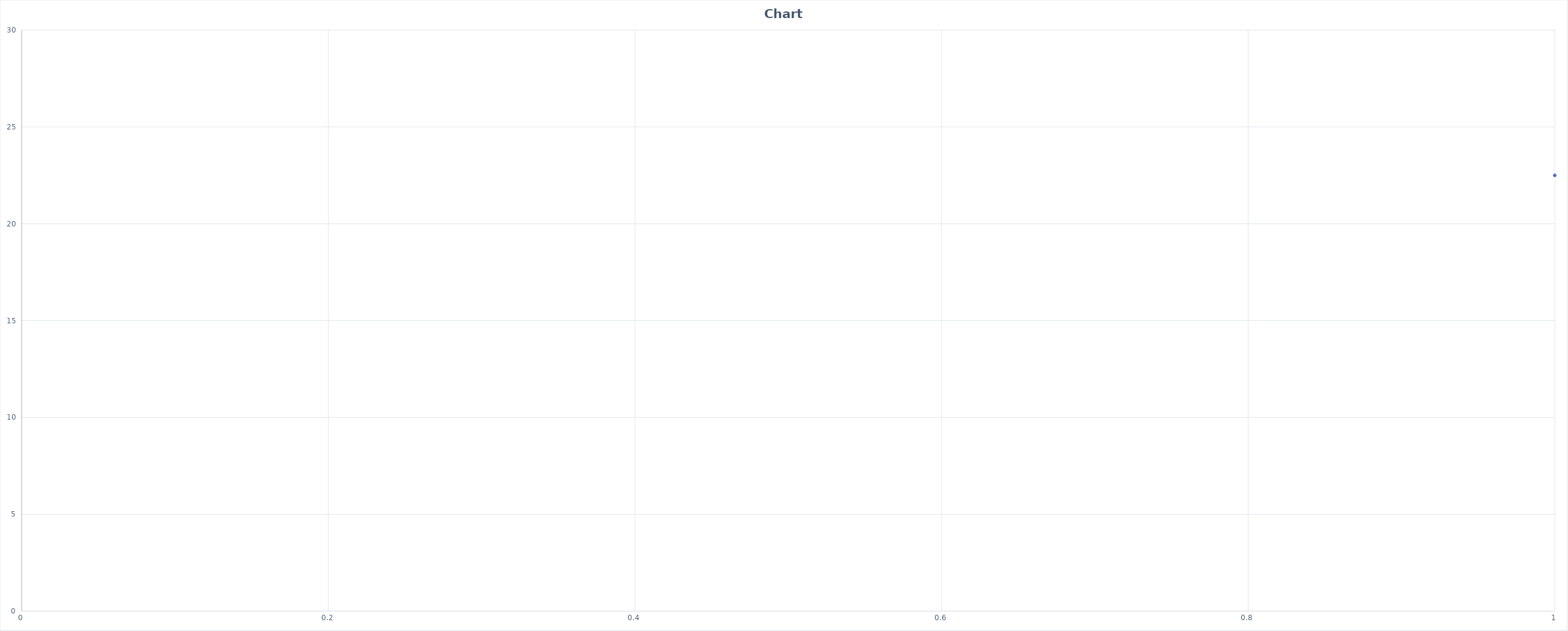
| Category | Series 0 |
|---|---|
| 0 | 22.5 |
| 1 | 22.5 |
| 2 | 22.5 |
| 3 | 22.5 |
| 4 | 22.5 |
| 5 | 22.5 |
| 6 | 22.5 |
| 7 | 22.5 |
| 8 | 22.5 |
| 9 | 22.5 |
| 10 | 22.5 |
| 11 | 22.5 |
| 12 | 22.5 |
| 13 | 22.5 |
| 14 | 22.5 |
| 15 | 22.5 |
| 16 | 22.5 |
| 17 | 22.5 |
| 18 | 22.5 |
| 19 | 22.5 |
| 20 | 22.5 |
| 21 | 22.5 |
| 22 | 22.5 |
| 23 | 22.6 |
| 24 | 22.6 |
| 25 | 22.6 |
| 26 | 22.6 |
| 27 | 22.5 |
| 28 | 22.5 |
| 29 | 22.5 |
| 30 | 22.5 |
| 31 | 22.5 |
| 32 | 22.5 |
| 33 | 22.5 |
| 34 | 22.5 |
| 35 | 22.5 |
| 36 | 22.5 |
| 37 | 22.5 |
| 38 | 22.5 |
| 39 | 22.5 |
| 40 | 22.5 |
| 41 | 22.5 |
| 42 | 22.5 |
| 43 | 22.5 |
| 44 | 22.5 |
| 45 | 22.5 |
| 46 | 22.5 |
| 47 | 22.5 |
| 48 | 22.5 |
| 49 | 22.5 |
| 50 | 22.5 |
| 51 | 23.2 |
| 52 | 23.5 |
| 53 | 23.8 |
| 54 | 23.9 |
| 55 | 24.1 |
| 56 | 24.2 |
| 57 | 24.2 |
| 58 | 24.3 |
| 59 | 24.3 |
| 60 | 24.3 |
| 61 | 24.3 |
| 62 | 24.3 |
| 63 | 24.3 |
| 64 | 24.3 |
| 65 | 24.3 |
| 66 | 24.2 |
| 67 | 24.2 |
| 68 | 24.2 |
| 69 | 24.1 |
| 70 | 24.1 |
| 71 | 24.1 |
| 72 | 24 |
| 73 | 24 |
| 74 | 22.8 |
| 75 | 22.8 |
| 76 | 22.8 |
| 77 | 22.8 |
| 78 | 22.7 |
| 79 | 22.7 |
| 80 | 22.7 |
| 81 | 22.7 |
| 82 | 22.7 |
| 83 | 22.7 |
| 84 | 22.6 |
| 85 | 22.6 |
| 86 | 22.6 |
| 87 | 22.6 |
| 88 | 22.6 |
| 89 | 22.6 |
| 90 | 22.6 |
| 91 | 22.6 |
| 92 | 22.5 |
| 93 | 22.5 |
| 94 | 22.5 |
| 95 | 22.5 |
| 96 | 22.5 |
| 97 | 22.5 |
| 98 | 22.5 |
| 99 | 22.5 |
| 100 | 22.5 |
| 101 | 22.5 |
| 102 | 22.5 |
| 103 | 22.5 |
| 104 | 22.5 |
| 105 | 22.5 |
| 106 | 22.5 |
| 107 | 22.5 |
| 108 | 22.5 |
| 109 | 22.5 |
| 110 | 22.5 |
| 111 | 22.5 |
| 112 | 22.5 |
| 113 | 22.5 |
| 114 | 22.5 |
| 115 | 22.5 |
| 116 | 22.5 |
| 117 | 22.5 |
| 118 | 22.5 |
| 119 | 22.6 |
| 120 | 22.6 |
| 121 | 22.6 |
| 122 | 22.6 |
| 123 | 22.6 |
| 124 | 22.7 |
| 125 | 22.7 |
| 126 | 22.7 |
| 127 | 22.7 |
| 128 | 22.8 |
| 129 | 22.9 |
| 130 | 22.9 |
| 131 | 22.9 |
| 132 | 22.9 |
| 133 | 22.9 |
| 134 | 22.9 |
| 135 | 22.9 |
| 136 | 22.9 |
| 137 | 22.9 |
| 138 | 22.9 |
| 139 | 22.9 |
| 140 | 22.9 |
| 141 | 22.8 |
| 142 | 22.7 |
| 143 | 22.6 |
| 144 | 22.6 |
| 145 | 22.6 |
| 146 | 22.5 |
| 147 | 23.1 |
| 148 | 23.4 |
| 149 | 23.6 |
| 150 | 23.8 |
| 151 | 23.9 |
| 152 | 23.9 |
| 153 | 24 |
| 154 | 24 |
| 155 | 24.1 |
| 156 | 24.1 |
| 157 | 24.1 |
| 158 | 24.1 |
| 159 | 24.1 |
| 160 | 24.1 |
| 161 | 24.1 |
| 162 | 24.1 |
| 163 | 24.1 |
| 164 | 24 |
| 165 | 24 |
| 166 | 24 |
| 167 | 24 |
| 168 | 23.9 |
| 169 | 23.9 |
| 170 | 22.8 |
| 171 | 22.8 |
| 172 | 22.8 |
| 173 | 22.8 |
| 174 | 22.8 |
| 175 | 22.7 |
| 176 | 22.7 |
| 177 | 22.7 |
| 178 | 22.7 |
| 179 | 22.7 |
| 180 | 22.7 |
| 181 | 22.7 |
| 182 | 22.6 |
| 183 | 22.6 |
| 184 | 22.6 |
| 185 | 22.6 |
| 186 | 22.6 |
| 187 | 22.6 |
| 188 | 22.6 |
| 189 | 22.6 |
| 190 | 22.6 |
| 191 | 22.6 |
| 192 | 22.6 |
| 193 | 22.6 |
| 194 | 22.6 |
| 195 | 22.6 |
| 196 | 22.6 |
| 197 | 22.6 |
| 198 | 22.7 |
| 199 | 22.7 |
| 200 | 22.7 |
| 201 | 22.7 |
| 202 | 22.7 |
| 203 | 22.7 |
| 204 | 22.7 |
| 205 | 22.7 |
| 206 | 22.7 |
| 207 | 22.7 |
| 208 | 22.7 |
| 209 | 22.7 |
| 210 | 22.7 |
| 211 | 22.7 |
| 212 | 22.7 |
| 213 | 22.6 |
| 214 | 22.6 |
| 215 | 22.6 |
| 216 | 22.6 |
| 217 | 22.6 |
| 218 | 22.6 |
| 219 | 22.6 |
| 220 | 22.6 |
| 221 | 22.6 |
| 222 | 22.7 |
| 223 | 22.7 |
| 224 | 22.7 |
| 225 | 22.7 |
| 226 | 22.7 |
| 227 | 22.7 |
| 228 | 22.7 |
| 229 | 22.6 |
| 230 | 22.6 |
| 231 | 22.6 |
| 232 | 22.6 |
| 233 | 22.6 |
| 234 | 22.6 |
| 235 | 22.6 |
| 236 | 22.6 |
| 237 | 22.6 |
| 238 | 22.6 |
| 239 | 22.6 |
| 240 | 22.6 |
| 241 | 22.6 |
| 242 | 22.4 |
| 243 | 22.5 |
| 244 | 22.5 |
| 245 | 22.4 |
| 246 | 22.4 |
| 247 | 22.4 |
| 248 | 22.3 |
| 249 | 22.3 |
| 250 | 22.3 |
| 251 | 22.2 |
| 252 | 22.2 |
| 253 | 22.1 |
| 254 | 22.1 |
| 255 | 22.1 |
| 256 | 22 |
| 257 | 22 |
| 258 | 22 |
| 259 | 21.9 |
| 260 | 21.9 |
| 261 | 21.9 |
| 262 | 21.8 |
| 263 | 21.8 |
| 264 | 21.7 |
| 265 | 21.6 |
| 266 | 22.4 |
| 267 | 22.7 |
| 268 | 22.7 |
| 269 | 22.7 |
| 270 | 22.7 |
| 271 | 22.8 |
| 272 | 22.7 |
| 273 | 22.7 |
| 274 | 22.7 |
| 275 | 22.7 |
| 276 | 22.7 |
| 277 | 22.7 |
| 278 | 22.7 |
| 279 | 22.7 |
| 280 | 22.6 |
| 281 | 22.6 |
| 282 | 22.6 |
| 283 | 22.6 |
| 284 | 22.6 |
| 285 | 22.6 |
| 286 | 22.5 |
| 287 | 22.5 |
| 288 | 22.5 |
| 289 | 22.5 |
| 290 | 22.5 |
| 291 | 22.5 |
| 292 | 22.5 |
| 293 | 22.5 |
| 294 | 22.5 |
| 295 | 22.5 |
| 296 | 22.5 |
| 297 | 22.5 |
| 298 | 22.5 |
| 299 | 22.5 |
| 300 | 22.5 |
| 301 | 22.5 |
| 302 | 22.5 |
| 303 | 22.5 |
| 304 | 22.5 |
| 305 | 22.5 |
| 306 | 22.5 |
| 307 | 22.5 |
| 308 | 22.5 |
| 309 | 22.5 |
| 310 | 22.5 |
| 311 | 22.5 |
| 312 | 22.5 |
| 313 | 22.5 |
| 314 | 22.5 |
| 315 | 22.5 |
| 316 | 22.5 |
| 317 | 22.5 |
| 318 | 22.5 |
| 319 | 22.5 |
| 320 | 22.5 |
| 321 | 22.5 |
| 322 | 22.5 |
| 323 | 22.4 |
| 324 | 22.4 |
| 325 | 22.4 |
| 326 | 22.4 |
| 327 | 22.4 |
| 328 | 22.4 |
| 329 | 22.4 |
| 330 | 22.4 |
| 331 | 22.4 |
| 332 | 22.4 |
| 333 | 22.4 |
| 334 | 22.4 |
| 335 | 22.4 |
| 336 | 22.4 |
| 337 | 22.4 |
| 338 | 22.4 |
| 339 | 22.7 |
| 340 | 22.8 |
| 341 | 22.9 |
| 342 | 22.9 |
| 343 | 22.9 |
| 344 | 23 |
| 345 | 23 |
| 346 | 23 |
| 347 | 23 |
| 348 | 23 |
| 349 | 23 |
| 350 | 23 |
| 351 | 23 |
| 352 | 23 |
| 353 | 23 |
| 354 | 23 |
| 355 | 23 |
| 356 | 23 |
| 357 | 23 |
| 358 | 22.9 |
| 359 | 22.9 |
| 360 | 22.9 |
| 361 | 22.9 |
| 362 | 22.6 |
| 363 | 22.7 |
| 364 | 22.7 |
| 365 | 22.7 |
| 366 | 22.7 |
| 367 | 22.7 |
| 368 | 22.6 |
| 369 | 22.6 |
| 370 | 22.6 |
| 371 | 22.6 |
| 372 | 22.5 |
| 373 | 22.5 |
| 374 | 22.5 |
| 375 | 22.5 |
| 376 | 22.5 |
| 377 | 22.5 |
| 378 | 22.5 |
| 379 | 22.5 |
| 380 | 22.5 |
| 381 | 22.5 |
| 382 | 22.5 |
| 383 | 22.5 |
| 384 | 22.5 |
| 385 | 22.5 |
| 386 | 22.5 |
| 387 | 22.5 |
| 388 | 22.5 |
| 389 | 22.5 |
| 390 | 22.5 |
| 391 | 22.5 |
| 392 | 22.4 |
| 393 | 22.4 |
| 394 | 22.4 |
| 395 | 22.4 |
| 396 | 22.4 |
| 397 | 22.4 |
| 398 | 22.4 |
| 399 | 22.4 |
| 400 | 22.4 |
| 401 | 22.4 |
| 402 | 22.4 |
| 403 | 22.4 |
| 404 | 22.4 |
| 405 | 22.4 |
| 406 | 22.4 |
| 407 | 22.4 |
| 408 | 22.4 |
| 409 | 22.4 |
| 410 | 22.4 |
| 411 | 22.4 |
| 412 | 22.4 |
| 413 | 22.4 |
| 414 | 0 |
| 415 | 0 |
| 416 | 0 |
| 417 | 0 |
| 418 | 0 |
| 419 | 0 |
| 420 | 0 |
| 421 | 0 |
| 422 | 0 |
| 423 | 0 |
| 424 | 0 |
| 425 | 0 |
| 426 | 0 |
| 427 | 0 |
| 428 | 0 |
| 429 | 0 |
| 430 | 0 |
| 431 | 0 |
| 432 | 0 |
| 433 | 0 |
| 434 | 0 |
| 435 | 0 |
| 436 | 0 |
| 437 | 0 |
| 438 | 0 |
| 439 | 0 |
| 440 | 0 |
| 441 | 0 |
| 442 | 0 |
| 443 | 0 |
| 444 | 0 |
| 445 | 0 |
| 446 | 0 |
| 447 | 0 |
| 448 | 0 |
| 449 | 0 |
| 450 | 0 |
| 451 | 0 |
| 452 | 0 |
| 453 | 0 |
| 454 | 0 |
| 455 | 0 |
| 456 | 0 |
| 457 | 0 |
| 458 | 0 |
| 459 | 0 |
| 460 | 0 |
| 461 | 0 |
| 462 | 0 |
| 463 | 0 |
| 464 | 0 |
| 465 | 0 |
| 466 | 0 |
| 467 | 0 |
| 468 | 0 |
| 469 | 0 |
| 470 | 0 |
| 471 | 0 |
| 472 | 0 |
| 473 | 0 |
| 474 | 0 |
| 475 | 0 |
| 476 | 0 |
| 477 | 0 |
| 478 | 0 |
| 479 | 0 |
| 480 | 0 |
| 481 | 0 |
| 482 | 0 |
| 483 | 0 |
| 484 | 0 |
| 485 | 0 |
| 486 | 0 |
| 487 | 0 |
| 488 | 0 |
| 489 | 0 |
| 490 | 0 |
| 491 | 0 |
| 492 | 0 |
| 493 | 0 |
| 494 | 0 |
| 495 | 0 |
| 496 | 0 |
| 497 | 0 |
| 498 | 0 |
| 499 | 0 |
| 500 | 0 |
| 501 | 0 |
| 502 | 0 |
| 503 | 0 |
| 504 | 0 |
| 505 | 0 |
| 506 | 0 |
| 507 | 0 |
| 508 | 0 |
| 509 | 0 |
| 510 | 0 |
| 511 | 0 |
| 512 | 0 |
| 513 | 0 |
| 514 | 0 |
| 515 | 0 |
| 516 | 0 |
| 517 | 0 |
| 518 | 0 |
| 519 | 0 |
| 520 | 0 |
| 521 | 0 |
| 522 | 0 |
| 523 | 0 |
| 524 | 0 |
| 525 | 0 |
| 526 | 0 |
| 527 | 0 |
| 528 | 0 |
| 529 | 0 |
| 530 | 0 |
| 531 | 0 |
| 532 | 0 |
| 533 | 0 |
| 534 | 0 |
| 535 | 0 |
| 536 | 0 |
| 537 | 0 |
| 538 | 0 |
| 539 | 0 |
| 540 | 0 |
| 541 | 0 |
| 542 | 0 |
| 543 | 0 |
| 544 | 0 |
| 545 | 0 |
| 546 | 0 |
| 547 | 0 |
| 548 | 0 |
| 549 | 0 |
| 550 | 0 |
| 551 | 0 |
| 552 | 0 |
| 553 | 0 |
| 554 | 0 |
| 555 | 0 |
| 556 | 0 |
| 557 | 0 |
| 558 | 0 |
| 559 | 0 |
| 560 | 0 |
| 561 | 0 |
| 562 | 0 |
| 563 | 0 |
| 564 | 0 |
| 565 | 0 |
| 566 | 0 |
| 567 | 0 |
| 568 | 0 |
| 569 | 0 |
| 570 | 0 |
| 571 | 0 |
| 572 | 0 |
| 573 | 0 |
| 574 | 0 |
| 575 | 0 |
| 576 | 0 |
| 577 | 0 |
| 578 | 0 |
| 579 | 0 |
| 580 | 0 |
| 581 | 0 |
| 582 | 0 |
| 583 | 0 |
| 584 | 0 |
| 585 | 0 |
| 586 | 0 |
| 587 | 0 |
| 588 | 0 |
| 589 | 0 |
| 590 | 0 |
| 591 | 0 |
| 592 | 0 |
| 593 | 0 |
| 594 | 0 |
| 595 | 0 |
| 596 | 0 |
| 597 | 0 |
| 598 | 0 |
| 599 | 0 |
| 600 | 0 |
| 601 | 0 |
| 602 | 0 |
| 603 | 0 |
| 604 | 0 |
| 605 | 0 |
| 606 | 0 |
| 607 | 0 |
| 608 | 0 |
| 609 | 0 |
| 610 | 0 |
| 611 | 0 |
| 612 | 0 |
| 613 | 0 |
| 614 | 0 |
| 615 | 0 |
| 616 | 0 |
| 617 | 0 |
| 618 | 0 |
| 619 | 0 |
| 620 | 0 |
| 621 | 0 |
| 622 | 0 |
| 623 | 0 |
| 624 | 0 |
| 625 | 0 |
| 626 | 0 |
| 627 | 0 |
| 628 | 0 |
| 629 | 0 |
| 630 | 0 |
| 631 | 0 |
| 632 | 0 |
| 633 | 0 |
| 634 | 0 |
| 635 | 0 |
| 636 | 0 |
| 637 | 0 |
| 638 | 0 |
| 639 | 0 |
| 640 | 0 |
| 641 | 0 |
| 642 | 0 |
| 643 | 0 |
| 644 | 0 |
| 645 | 0 |
| 646 | 0 |
| 647 | 0 |
| 648 | 0 |
| 649 | 0 |
| 650 | 0 |
| 651 | 0 |
| 652 | 0 |
| 653 | 0 |
| 654 | 0 |
| 655 | 0 |
| 656 | 0 |
| 657 | 0 |
| 658 | 0 |
| 659 | 0 |
| 660 | 0 |
| 661 | 0 |
| 662 | 0 |
| 663 | 0 |
| 664 | 0 |
| 665 | 0 |
| 666 | 0 |
| 667 | 0 |
| 668 | 0 |
| 669 | 0 |
| 670 | 0 |
| 671 | 0 |
| 672 | 0 |
| 673 | 0 |
| 674 | 0 |
| 675 | 0 |
| 676 | 0 |
| 677 | 0 |
| 678 | 0 |
| 679 | 0 |
| 680 | 0 |
| 681 | 0 |
| 682 | 0 |
| 683 | 0 |
| 684 | 0 |
| 685 | 0 |
| 686 | 0 |
| 687 | 0 |
| 688 | 0 |
| 689 | 0 |
| 690 | 0 |
| 691 | 0 |
| 692 | 0 |
| 693 | 0 |
| 694 | 0 |
| 695 | 0 |
| 696 | 0 |
| 697 | 0 |
| 698 | 0 |
| 699 | 0 |
| 700 | 0 |
| 701 | 0 |
| 702 | 0 |
| 703 | 0 |
| 704 | 0 |
| 705 | 0 |
| 706 | 0 |
| 707 | 0 |
| 708 | 0 |
| 709 | 0 |
| 710 | 0 |
| 711 | 0 |
| 712 | 0 |
| 713 | 0 |
| 714 | 0 |
| 715 | 0 |
| 716 | 0 |
| 717 | 0 |
| 718 | 0 |
| 719 | 0 |
| 720 | 0 |
| 721 | 0 |
| 722 | 0 |
| 723 | 0 |
| 724 | 0 |
| 725 | 0 |
| 726 | 0 |
| 727 | 0 |
| 728 | 0 |
| 729 | 0 |
| 730 | 0 |
| 731 | 0 |
| 732 | 0 |
| 733 | 0 |
| 734 | 0 |
| 735 | 0 |
| 736 | 0 |
| 737 | 0 |
| 738 | 0 |
| 739 | 0 |
| 740 | 0 |
| 741 | 0 |
| 742 | 0 |
| 743 | 0 |
| 744 | 0 |
| 745 | 0 |
| 746 | 0 |
| 747 | 0 |
| 748 | 0 |
| 749 | 0 |
| 750 | 0 |
| 751 | 0 |
| 752 | 0 |
| 753 | 0 |
| 754 | 0 |
| 755 | 0 |
| 756 | 0 |
| 757 | 0 |
| 758 | 0 |
| 759 | 0 |
| 760 | 0 |
| 761 | 0 |
| 762 | 0 |
| 763 | 0 |
| 764 | 0 |
| 765 | 0 |
| 766 | 0 |
| 767 | 0 |
| 768 | 0 |
| 769 | 0 |
| 770 | 0 |
| 771 | 0 |
| 772 | 0 |
| 773 | 0 |
| 774 | 0 |
| 775 | 0 |
| 776 | 0 |
| 777 | 0 |
| 778 | 0 |
| 779 | 0 |
| 780 | 0 |
| 781 | 0 |
| 782 | 0 |
| 783 | 0 |
| 784 | 0 |
| 785 | 0 |
| 786 | 0 |
| 787 | 0 |
| 788 | 0 |
| 789 | 0 |
| 790 | 0 |
| 791 | 0 |
| 792 | 0 |
| 793 | 0 |
| 794 | 0 |
| 795 | 0 |
| 796 | 0 |
| 797 | 0 |
| 798 | 0 |
| 799 | 0 |
| 800 | 0 |
| 801 | 0 |
| 802 | 0 |
| 803 | 0 |
| 804 | 0 |
| 805 | 0 |
| 806 | 0 |
| 807 | 0 |
| 808 | 0 |
| 809 | 0 |
| 810 | 0 |
| 811 | 0 |
| 812 | 0 |
| 813 | 0 |
| 814 | 0 |
| 815 | 0 |
| 816 | 0 |
| 817 | 0 |
| 818 | 0 |
| 819 | 0 |
| 820 | 0 |
| 821 | 0 |
| 822 | 0 |
| 823 | 0 |
| 824 | 0 |
| 825 | 0 |
| 826 | 0 |
| 827 | 0 |
| 828 | 0 |
| 829 | 0 |
| 830 | 0 |
| 831 | 0 |
| 832 | 0 |
| 833 | 0 |
| 834 | 0 |
| 835 | 0 |
| 836 | 0 |
| 837 | 0 |
| 838 | 0 |
| 839 | 0 |
| 840 | 0 |
| 841 | 0 |
| 842 | 0 |
| 843 | 0 |
| 844 | 0 |
| 845 | 0 |
| 846 | 0 |
| 847 | 0 |
| 848 | 0 |
| 849 | 0 |
| 850 | 0 |
| 851 | 0 |
| 852 | 0 |
| 853 | 0 |
| 854 | 0 |
| 855 | 0 |
| 856 | 0 |
| 857 | 0 |
| 858 | 0 |
| 859 | 0 |
| 860 | 0 |
| 861 | 0 |
| 862 | 0 |
| 863 | 0 |
| 864 | 0 |
| 865 | 0 |
| 866 | 0 |
| 867 | 0 |
| 868 | 0 |
| 869 | 0 |
| 870 | 0 |
| 871 | 0 |
| 872 | 0 |
| 873 | 0 |
| 874 | 0 |
| 875 | 0 |
| 876 | 0 |
| 877 | 0 |
| 878 | 0 |
| 879 | 0 |
| 880 | 0 |
| 881 | 0 |
| 882 | 0 |
| 883 | 0 |
| 884 | 0 |
| 885 | 0 |
| 886 | 0 |
| 887 | 0 |
| 888 | 0 |
| 889 | 0 |
| 890 | 0 |
| 891 | 0 |
| 892 | 0 |
| 893 | 0 |
| 894 | 0 |
| 895 | 0 |
| 896 | 0 |
| 897 | 0 |
| 898 | 0 |
| 899 | 0 |
| 900 | 0 |
| 901 | 0 |
| 902 | 0 |
| 903 | 0 |
| 904 | 0 |
| 905 | 0 |
| 906 | 0 |
| 907 | 0 |
| 908 | 0 |
| 909 | 0 |
| 910 | 0 |
| 911 | 0 |
| 912 | 0 |
| 913 | 0 |
| 914 | 0 |
| 915 | 0 |
| 916 | 0 |
| 917 | 0 |
| 918 | 0 |
| 919 | 0 |
| 920 | 0 |
| 921 | 0 |
| 922 | 0 |
| 923 | 0 |
| 924 | 0 |
| 925 | 0 |
| 926 | 0 |
| 927 | 0 |
| 928 | 0 |
| 929 | 0 |
| 930 | 0 |
| 931 | 0 |
| 932 | 0 |
| 933 | 0 |
| 934 | 0 |
| 935 | 0 |
| 936 | 0 |
| 937 | 0 |
| 938 | 0 |
| 939 | 0 |
| 940 | 0 |
| 941 | 0 |
| 942 | 0 |
| 943 | 0 |
| 944 | 0 |
| 945 | 0 |
| 946 | 0 |
| 947 | 0 |
| 948 | 0 |
| 949 | 0 |
| 950 | 0 |
| 951 | 0 |
| 952 | 0 |
| 953 | 0 |
| 954 | 0 |
| 955 | 0 |
| 956 | 0 |
| 957 | 0 |
| 958 | 0 |
| 959 | 0 |
| 960 | 0 |
| 961 | 0 |
| 962 | 0 |
| 963 | 0 |
| 964 | 0 |
| 965 | 0 |
| 966 | 0 |
| 967 | 0 |
| 968 | 0 |
| 969 | 0 |
| 970 | 0 |
| 971 | 0 |
| 972 | 0 |
| 973 | 0 |
| 974 | 0 |
| 975 | 0 |
| 976 | 0 |
| 977 | 0 |
| 978 | 0 |
| 979 | 0 |
| 980 | 0 |
| 981 | 0 |
| 982 | 0 |
| 983 | 0 |
| 984 | 0 |
| 985 | 0 |
| 986 | 0 |
| 987 | 0 |
| 988 | 0 |
| 989 | 0 |
| 990 | 0 |
| 991 | 0 |
| 992 | 0 |
| 993 | 0 |
| 994 | 0 |
| 995 | 0 |
| 996 | 0 |
| 997 | 0 |
| 998 | 0 |
| 999 | 0 |
| 1000 | 0 |
| 1001 | 0 |
| 1002 | 0 |
| 1003 | 0 |
| 1004 | 0 |
| 1005 | 0 |
| 1006 | 0 |
| 1007 | 0 |
| 1008 | 0 |
| 1009 | 0 |
| 1010 | 0 |
| 1011 | 0 |
| 1012 | 0 |
| 1013 | 0 |
| 1014 | 0 |
| 1015 | 0 |
| 1016 | 0 |
| 1017 | 0 |
| 1018 | 0 |
| 1019 | 0 |
| 1020 | 0 |
| 1021 | 0 |
| 1022 | 0 |
| 1023 | 0 |
| 1024 | 0 |
| 1025 | 0 |
| 1026 | 0 |
| 1027 | 0 |
| 1028 | 0 |
| 1029 | 0 |
| 1030 | 0 |
| 1031 | 0 |
| 1032 | 0 |
| 1033 | 0 |
| 1034 | 0 |
| 1035 | 0 |
| 1036 | 0 |
| 1037 | 0 |
| 1038 | 0 |
| 1039 | 0 |
| 1040 | 0 |
| 1041 | 0 |
| 1042 | 0 |
| 1043 | 0 |
| 1044 | 0 |
| 1045 | 0 |
| 1046 | 0 |
| 1047 | 0 |
| 1048 | 0 |
| 1049 | 0 |
| 1050 | 0 |
| 1051 | 0 |
| 1052 | 0 |
| 1053 | 0 |
| 1054 | 0 |
| 1055 | 0 |
| 1056 | 0 |
| 1057 | 0 |
| 1058 | 0 |
| 1059 | 0 |
| 1060 | 0 |
| 1061 | 0 |
| 1062 | 0 |
| 1063 | 0 |
| 1064 | 0 |
| 1065 | 0 |
| 1066 | 0 |
| 1067 | 0 |
| 1068 | 0 |
| 1069 | 0 |
| 1070 | 0 |
| 1071 | 0 |
| 1072 | 0 |
| 1073 | 0 |
| 1074 | 0 |
| 1075 | 0 |
| 1076 | 0 |
| 1077 | 0 |
| 1078 | 0 |
| 1079 | 0 |
| 1080 | 0 |
| 1081 | 0 |
| 1082 | 0 |
| 1083 | 0 |
| 1084 | 0 |
| 1085 | 0 |
| 1086 | 0 |
| 1087 | 0 |
| 1088 | 0 |
| 1089 | 0 |
| 1090 | 0 |
| 1091 | 0 |
| 1092 | 0 |
| 1093 | 0 |
| 1094 | 0 |
| 1095 | 0 |
| 1096 | 0 |
| 1097 | 0 |
| 1098 | 0 |
| 1099 | 0 |
| 1100 | 0 |
| 1101 | 0 |
| 1102 | 0 |
| 1103 | 0 |
| 1104 | 0 |
| 1105 | 0 |
| 1106 | 0 |
| 1107 | 0 |
| 1108 | 0 |
| 1109 | 0 |
| 1110 | 0 |
| 1111 | 0 |
| 1112 | 0 |
| 1113 | 0 |
| 1114 | 0 |
| 1115 | 0 |
| 1116 | 0 |
| 1117 | 0 |
| 1118 | 0 |
| 1119 | 0 |
| 1120 | 0 |
| 1121 | 0 |
| 1122 | 0 |
| 1123 | 0 |
| 1124 | 0 |
| 1125 | 0 |
| 1126 | 0 |
| 1127 | 0 |
| 1128 | 0 |
| 1129 | 0 |
| 1130 | 0 |
| 1131 | 0 |
| 1132 | 0 |
| 1133 | 0 |
| 1134 | 0 |
| 1135 | 0 |
| 1136 | 0 |
| 1137 | 0 |
| 1138 | 0 |
| 1139 | 0 |
| 1140 | 0 |
| 1141 | 0 |
| 1142 | 0 |
| 1143 | 0 |
| 1144 | 0 |
| 1145 | 0 |
| 1146 | 0 |
| 1147 | 0 |
| 1148 | 0 |
| 1149 | 0 |
| 1150 | 0 |
| 1151 | 0 |
| 1152 | 0 |
| 1153 | 0 |
| 1154 | 0 |
| 1155 | 0 |
| 1156 | 0 |
| 1157 | 0 |
| 1158 | 0 |
| 1159 | 0 |
| 1160 | 0 |
| 1161 | 0 |
| 1162 | 0 |
| 1163 | 0 |
| 1164 | 0 |
| 1165 | 0 |
| 1166 | 0 |
| 1167 | 0 |
| 1168 | 0 |
| 1169 | 0 |
| 1170 | 0 |
| 1171 | 0 |
| 1172 | 0 |
| 1173 | 0 |
| 1174 | 0 |
| 1175 | 0 |
| 1176 | 0 |
| 1177 | 0 |
| 1178 | 0 |
| 1179 | 0 |
| 1180 | 0 |
| 1181 | 0 |
| 1182 | 0 |
| 1183 | 0 |
| 1184 | 0 |
| 1185 | 0 |
| 1186 | 0 |
| 1187 | 0 |
| 1188 | 0 |
| 1189 | 0 |
| 1190 | 0 |
| 1191 | 0 |
| 1192 | 0 |
| 1193 | 0 |
| 1194 | 0 |
| 1195 | 0 |
| 1196 | 0 |
| 1197 | 0 |
| 1198 | 0 |
| 1199 | 0 |
| 1200 | 0 |
| 1201 | 0 |
| 1202 | 0 |
| 1203 | 0 |
| 1204 | 0 |
| 1205 | 0 |
| 1206 | 0 |
| 1207 | 0 |
| 1208 | 0 |
| 1209 | 0 |
| 1210 | 0 |
| 1211 | 0 |
| 1212 | 0 |
| 1213 | 0 |
| 1214 | 0 |
| 1215 | 0 |
| 1216 | 0 |
| 1217 | 0 |
| 1218 | 0 |
| 1219 | 0 |
| 1220 | 0 |
| 1221 | 0 |
| 1222 | 0 |
| 1223 | 0 |
| 1224 | 0 |
| 1225 | 0 |
| 1226 | 0 |
| 1227 | 0 |
| 1228 | 0 |
| 1229 | 0 |
| 1230 | 0 |
| 1231 | 0 |
| 1232 | 0 |
| 1233 | 0 |
| 1234 | 0 |
| 1235 | 0 |
| 1236 | 0 |
| 1237 | 0 |
| 1238 | 0 |
| 1239 | 0 |
| 1240 | 0 |
| 1241 | 0 |
| 1242 | 0 |
| 1243 | 0 |
| 1244 | 0 |
| 1245 | 0 |
| 1246 | 0 |
| 1247 | 0 |
| 1248 | 0 |
| 1249 | 0 |
| 1250 | 0 |
| 1251 | 0 |
| 1252 | 0 |
| 1253 | 0 |
| 1254 | 0 |
| 1255 | 0 |
| 1256 | 0 |
| 1257 | 0 |
| 1258 | 0 |
| 1259 | 0 |
| 1260 | 0 |
| 1261 | 0 |
| 1262 | 0 |
| 1263 | 0 |
| 1264 | 0 |
| 1265 | 0 |
| 1266 | 0 |
| 1267 | 0 |
| 1268 | 0 |
| 1269 | 0 |
| 1270 | 0 |
| 1271 | 0 |
| 1272 | 0 |
| 1273 | 0 |
| 1274 | 0 |
| 1275 | 0 |
| 1276 | 0 |
| 1277 | 0 |
| 1278 | 0 |
| 1279 | 0 |
| 1280 | 0 |
| 1281 | 0 |
| 1282 | 0 |
| 1283 | 0 |
| 1284 | 0 |
| 1285 | 0 |
| 1286 | 0 |
| 1287 | 0 |
| 1288 | 0 |
| 1289 | 0 |
| 1290 | 0 |
| 1291 | 0 |
| 1292 | 0 |
| 1293 | 0 |
| 1294 | 0 |
| 1295 | 0 |
| 1296 | 0 |
| 1297 | 0 |
| 1298 | 0 |
| 1299 | 0 |
| 1300 | 0 |
| 1301 | 0 |
| 1302 | 0 |
| 1303 | 0 |
| 1304 | 0 |
| 1305 | 0 |
| 1306 | 0 |
| 1307 | 0 |
| 1308 | 0 |
| 1309 | 0 |
| 1310 | 0 |
| 1311 | 0 |
| 1312 | 0 |
| 1313 | 0 |
| 1314 | 0 |
| 1315 | 0 |
| 1316 | 0 |
| 1317 | 0 |
| 1318 | 0 |
| 1319 | 0 |
| 1320 | 0 |
| 1321 | 0 |
| 1322 | 0 |
| 1323 | 0 |
| 1324 | 0 |
| 1325 | 0 |
| 1326 | 0 |
| 1327 | 0 |
| 1328 | 0 |
| 1329 | 0 |
| 1330 | 0 |
| 1331 | 0 |
| 1332 | 0 |
| 1333 | 0 |
| 1334 | 0 |
| 1335 | 0 |
| 1336 | 0 |
| 1337 | 0 |
| 1338 | 0 |
| 1339 | 0 |
| 1340 | 0 |
| 1341 | 0 |
| 1342 | 0 |
| 1343 | 0 |
| 1344 | 0 |
| 1345 | 0 |
| 1346 | 0 |
| 1347 | 0 |
| 1348 | 0 |
| 1349 | 0 |
| 1350 | 0 |
| 1351 | 0 |
| 1352 | 0 |
| 1353 | 0 |
| 1354 | 0 |
| 1355 | 0 |
| 1356 | 0 |
| 1357 | 0 |
| 1358 | 0 |
| 1359 | 0 |
| 1360 | 0 |
| 1361 | 0 |
| 1362 | 0 |
| 1363 | 0 |
| 1364 | 0 |
| 1365 | 0 |
| 1366 | 0 |
| 1367 | 0 |
| 1368 | 0 |
| 1369 | 0 |
| 1370 | 0 |
| 1371 | 0 |
| 1372 | 0 |
| 1373 | 0 |
| 1374 | 0 |
| 1375 | 0 |
| 1376 | 0 |
| 1377 | 0 |
| 1378 | 0 |
| 1379 | 0 |
| 1380 | 0 |
| 1381 | 0 |
| 1382 | 0 |
| 1383 | 0 |
| 1384 | 0 |
| 1385 | 0 |
| 1386 | 0 |
| 1387 | 0 |
| 1388 | 0 |
| 1389 | 0 |
| 1390 | 0 |
| 1391 | 0 |
| 1392 | 0 |
| 1393 | 0 |
| 1394 | 0 |
| 1395 | 0 |
| 1396 | 0 |
| 1397 | 0 |
| 1398 | 0 |
| 1399 | 0 |
| 1400 | 0 |
| 1401 | 0 |
| 1402 | 0 |
| 1403 | 0 |
| 1404 | 0 |
| 1405 | 0 |
| 1406 | 0 |
| 1407 | 0 |
| 1408 | 0 |
| 1409 | 0 |
| 1410 | 0 |
| 1411 | 0 |
| 1412 | 0 |
| 1413 | 0 |
| 1414 | 0 |
| 1415 | 0 |
| 1416 | 0 |
| 1417 | 0 |
| 1418 | 0 |
| 1419 | 0 |
| 1420 | 0 |
| 1421 | 0 |
| 1422 | 0 |
| 1423 | 0 |
| 1424 | 0 |
| 1425 | 0 |
| 1426 | 0 |
| 1427 | 0 |
| 1428 | 0 |
| 1429 | 0 |
| 1430 | 0 |
| 1431 | 0 |
| 1432 | 0 |
| 1433 | 0 |
| 1434 | 0 |
| 1435 | 0 |
| 1436 | 0 |
| 1437 | 0 |
| 1438 | 0 |
| 1439 | 0 |
| 1440 | 0 |
| 1441 | 0 |
| 1442 | 0 |
| 1443 | 0 |
| 1444 | 0 |
| 1445 | 0 |
| 1446 | 0 |
| 1447 | 0 |
| 1448 | 0 |
| 1449 | 0 |
| 1450 | 0 |
| 1451 | 0 |
| 1452 | 0 |
| 1453 | 0 |
| 1454 | 0 |
| 1455 | 0 |
| 1456 | 0 |
| 1457 | 0 |
| 1458 | 0 |
| 1459 | 0 |
| 1460 | 0 |
| 1461 | 0 |
| 1462 | 0 |
| 1463 | 0 |
| 1464 | 0 |
| 1465 | 0 |
| 1466 | 0 |
| 1467 | 0 |
| 1468 | 0 |
| 1469 | 0 |
| 1470 | 0 |
| 1471 | 0 |
| 1472 | 0 |
| 1473 | 0 |
| 1474 | 0 |
| 1475 | 0 |
| 1476 | 0 |
| 1477 | 0 |
| 1478 | 0 |
| 1479 | 0 |
| 1480 | 0 |
| 1481 | 0 |
| 1482 | 0 |
| 1483 | 0 |
| 1484 | 0 |
| 1485 | 0 |
| 1486 | 0 |
| 1487 | 0 |
| 1488 | 0 |
| 1489 | 0 |
| 1490 | 0 |
| 1491 | 0 |
| 1492 | 0 |
| 1493 | 0 |
| 1494 | 0 |
| 1495 | 0 |
| 1496 | 0 |
| 1497 | 0 |
| 1498 | 0 |
| 1499 | 0 |
| 1500 | 0 |
| 1501 | 0 |
| 1502 | 0 |
| 1503 | 0 |
| 1504 | 0 |
| 1505 | 0 |
| 1506 | 0 |
| 1507 | 0 |
| 1508 | 0 |
| 1509 | 0 |
| 1510 | 0 |
| 1511 | 0 |
| 1512 | 0 |
| 1513 | 0 |
| 1514 | 0 |
| 1515 | 0 |
| 1516 | 0 |
| 1517 | 0 |
| 1518 | 0 |
| 1519 | 0 |
| 1520 | 0 |
| 1521 | 0 |
| 1522 | 0 |
| 1523 | 0 |
| 1524 | 0 |
| 1525 | 0 |
| 1526 | 0 |
| 1527 | 0 |
| 1528 | 0 |
| 1529 | 0 |
| 1530 | 0 |
| 1531 | 0 |
| 1532 | 0 |
| 1533 | 0 |
| 1534 | 0 |
| 1535 | 0 |
| 1536 | 0 |
| 1537 | 0 |
| 1538 | 0 |
| 1539 | 0 |
| 1540 | 0 |
| 1541 | 0 |
| 1542 | 0 |
| 1543 | 0 |
| 1544 | 0 |
| 1545 | 0 |
| 1546 | 0 |
| 1547 | 0 |
| 1548 | 0 |
| 1549 | 0 |
| 1550 | 0 |
| 1551 | 0 |
| 1552 | 0 |
| 1553 | 0 |
| 1554 | 0 |
| 1555 | 0 |
| 1556 | 0 |
| 1557 | 0 |
| 1558 | 0 |
| 1559 | 0 |
| 1560 | 0 |
| 1561 | 0 |
| 1562 | 0 |
| 1563 | 0 |
| 1564 | 0 |
| 1565 | 0 |
| 1566 | 0 |
| 1567 | 0 |
| 1568 | 0 |
| 1569 | 0 |
| 1570 | 0 |
| 1571 | 0 |
| 1572 | 0 |
| 1573 | 0 |
| 1574 | 0 |
| 1575 | 0 |
| 1576 | 0 |
| 1577 | 0 |
| 1578 | 0 |
| 1579 | 0 |
| 1580 | 0 |
| 1581 | 0 |
| 1582 | 0 |
| 1583 | 0 |
| 1584 | 0 |
| 1585 | 0 |
| 1586 | 0 |
| 1587 | 0 |
| 1588 | 0 |
| 1589 | 0 |
| 1590 | 0 |
| 1591 | 0 |
| 1592 | 0 |
| 1593 | 0 |
| 1594 | 0 |
| 1595 | 0 |
| 1596 | 0 |
| 1597 | 0 |
| 1598 | 0 |
| 1599 | 0 |
| 1600 | 0 |
| 1601 | 0 |
| 1602 | 0 |
| 1603 | 0 |
| 1604 | 0 |
| 1605 | 0 |
| 1606 | 0 |
| 1607 | 0 |
| 1608 | 0 |
| 1609 | 0 |
| 1610 | 0 |
| 1611 | 0 |
| 1612 | 0 |
| 1613 | 0 |
| 1614 | 0 |
| 1615 | 0 |
| 1616 | 0 |
| 1617 | 0 |
| 1618 | 0 |
| 1619 | 0 |
| 1620 | 0 |
| 1621 | 0 |
| 1622 | 0 |
| 1623 | 0 |
| 1624 | 0 |
| 1625 | 0 |
| 1626 | 0 |
| 1627 | 0 |
| 1628 | 0 |
| 1629 | 0 |
| 1630 | 0 |
| 1631 | 0 |
| 1632 | 0 |
| 1633 | 0 |
| 1634 | 0 |
| 1635 | 0 |
| 1636 | 0 |
| 1637 | 0 |
| 1638 | 0 |
| 1639 | 0 |
| 1640 | 0 |
| 1641 | 0 |
| 1642 | 0 |
| 1643 | 0 |
| 1644 | 0 |
| 1645 | 0 |
| 1646 | 0 |
| 1647 | 0 |
| 1648 | 0 |
| 1649 | 0 |
| 1650 | 0 |
| 1651 | 0 |
| 1652 | 0 |
| 1653 | 0 |
| 1654 | 0 |
| 1655 | 0 |
| 1656 | 0 |
| 1657 | 0 |
| 1658 | 0 |
| 1659 | 0 |
| 1660 | 0 |
| 1661 | 0 |
| 1662 | 0 |
| 1663 | 0 |
| 1664 | 0 |
| 1665 | 0 |
| 1666 | 0 |
| 1667 | 0 |
| 1668 | 0 |
| 1669 | 0 |
| 1670 | 0 |
| 1671 | 0 |
| 1672 | 0 |
| 1673 | 0 |
| 1674 | 0 |
| 1675 | 0 |
| 1676 | 0 |
| 1677 | 0 |
| 1678 | 0 |
| 1679 | 0 |
| 1680 | 0 |
| 1681 | 0 |
| 1682 | 0 |
| 1683 | 0 |
| 1684 | 0 |
| 1685 | 0 |
| 1686 | 0 |
| 1687 | 0 |
| 1688 | 0 |
| 1689 | 0 |
| 1690 | 0 |
| 1691 | 0 |
| 1692 | 0 |
| 1693 | 0 |
| 1694 | 0 |
| 1695 | 0 |
| 1696 | 0 |
| 1697 | 0 |
| 1698 | 0 |
| 1699 | 0 |
| 1700 | 0 |
| 1701 | 0 |
| 1702 | 0 |
| 1703 | 0 |
| 1704 | 0 |
| 1705 | 0 |
| 1706 | 0 |
| 1707 | 0 |
| 1708 | 0 |
| 1709 | 0 |
| 1710 | 0 |
| 1711 | 0 |
| 1712 | 0 |
| 1713 | 0 |
| 1714 | 0 |
| 1715 | 0 |
| 1716 | 0 |
| 1717 | 0 |
| 1718 | 0 |
| 1719 | 0 |
| 1720 | 0 |
| 1721 | 0 |
| 1722 | 0 |
| 1723 | 0 |
| 1724 | 0 |
| 1725 | 0 |
| 1726 | 0 |
| 1727 | 0 |
| 1728 | 0 |
| 1729 | 0 |
| 1730 | 0 |
| 1731 | 0 |
| 1732 | 0 |
| 1733 | 0 |
| 1734 | 0 |
| 1735 | 0 |
| 1736 | 0 |
| 1737 | 0 |
| 1738 | 0 |
| 1739 | 0 |
| 1740 | 0 |
| 1741 | 0 |
| 1742 | 0 |
| 1743 | 0 |
| 1744 | 0 |
| 1745 | 0 |
| 1746 | 0 |
| 1747 | 0 |
| 1748 | 0 |
| 1749 | 0 |
| 1750 | 0 |
| 1751 | 0 |
| 1752 | 0 |
| 1753 | 0 |
| 1754 | 0 |
| 1755 | 0 |
| 1756 | 0 |
| 1757 | 0 |
| 1758 | 0 |
| 1759 | 0 |
| 1760 | 0 |
| 1761 | 0 |
| 1762 | 0 |
| 1763 | 0 |
| 1764 | 0 |
| 1765 | 0 |
| 1766 | 0 |
| 1767 | 0 |
| 1768 | 0 |
| 1769 | 0 |
| 1770 | 0 |
| 1771 | 0 |
| 1772 | 0 |
| 1773 | 0 |
| 1774 | 0 |
| 1775 | 0 |
| 1776 | 0 |
| 1777 | 0 |
| 1778 | 0 |
| 1779 | 0 |
| 1780 | 0 |
| 1781 | 0 |
| 1782 | 0 |
| 1783 | 0 |
| 1784 | 0 |
| 1785 | 0 |
| 1786 | 0 |
| 1787 | 0 |
| 1788 | 0 |
| 1789 | 0 |
| 1790 | 0 |
| 1791 | 0 |
| 1792 | 0 |
| 1793 | 0 |
| 1794 | 0 |
| 1795 | 0 |
| 1796 | 0 |
| 1797 | 0 |
| 1798 | 0 |
| 1799 | 0 |
| 1800 | 0 |
| 1801 | 0 |
| 1802 | 0 |
| 1803 | 0 |
| 1804 | 0 |
| 1805 | 0 |
| 1806 | 0 |
| 1807 | 0 |
| 1808 | 0 |
| 1809 | 0 |
| 1810 | 0 |
| 1811 | 0 |
| 1812 | 0 |
| 1813 | 0 |
| 1814 | 0 |
| 1815 | 0 |
| 1816 | 0 |
| 1817 | 0 |
| 1818 | 0 |
| 1819 | 0 |
| 1820 | 0 |
| 1821 | 0 |
| 1822 | 0 |
| 1823 | 0 |
| 1824 | 0 |
| 1825 | 0 |
| 1826 | 0 |
| 1827 | 0 |
| 1828 | 0 |
| 1829 | 0 |
| 1830 | 0 |
| 1831 | 0 |
| 1832 | 0 |
| 1833 | 0 |
| 1834 | 0 |
| 1835 | 0 |
| 1836 | 0 |
| 1837 | 0 |
| 1838 | 0 |
| 1839 | 0 |
| 1840 | 0 |
| 1841 | 0 |
| 1842 | 0 |
| 1843 | 0 |
| 1844 | 0 |
| 1845 | 0 |
| 1846 | 0 |
| 1847 | 0 |
| 1848 | 0 |
| 1849 | 0 |
| 1850 | 0 |
| 1851 | 0 |
| 1852 | 0 |
| 1853 | 0 |
| 1854 | 0 |
| 1855 | 0 |
| 1856 | 0 |
| 1857 | 0 |
| 1858 | 0 |
| 1859 | 0 |
| 1860 | 0 |
| 1861 | 0 |
| 1862 | 0 |
| 1863 | 0 |
| 1864 | 0 |
| 1865 | 0 |
| 1866 | 0 |
| 1867 | 0 |
| 1868 | 0 |
| 1869 | 0 |
| 1870 | 0 |
| 1871 | 0 |
| 1872 | 0 |
| 1873 | 0 |
| 1874 | 0 |
| 1875 | 0 |
| 1876 | 0 |
| 1877 | 0 |
| 1878 | 0 |
| 1879 | 0 |
| 1880 | 0 |
| 1881 | 0 |
| 1882 | 0 |
| 1883 | 0 |
| 1884 | 0 |
| 1885 | 0 |
| 1886 | 0 |
| 1887 | 0 |
| 1888 | 0 |
| 1889 | 0 |
| 1890 | 0 |
| 1891 | 0 |
| 1892 | 0 |
| 1893 | 0 |
| 1894 | 0 |
| 1895 | 0 |
| 1896 | 0 |
| 1897 | 0 |
| 1898 | 0 |
| 1899 | 0 |
| 1900 | 0 |
| 1901 | 0 |
| 1902 | 0 |
| 1903 | 0 |
| 1904 | 0 |
| 1905 | 0 |
| 1906 | 0 |
| 1907 | 0 |
| 1908 | 0 |
| 1909 | 0 |
| 1910 | 0 |
| 1911 | 0 |
| 1912 | 0 |
| 1913 | 0 |
| 1914 | 0 |
| 1915 | 0 |
| 1916 | 0 |
| 1917 | 0 |
| 1918 | 0 |
| 1919 | 0 |
| 1920 | 0 |
| 1921 | 0 |
| 1922 | 0 |
| 1923 | 0 |
| 1924 | 0 |
| 1925 | 0 |
| 1926 | 0 |
| 1927 | 0 |
| 1928 | 0 |
| 1929 | 0 |
| 1930 | 0 |
| 1931 | 0 |
| 1932 | 0 |
| 1933 | 0 |
| 1934 | 0 |
| 1935 | 0 |
| 1936 | 0 |
| 1937 | 0 |
| 1938 | 0 |
| 1939 | 0 |
| 1940 | 0 |
| 1941 | 0 |
| 1942 | 0 |
| 1943 | 0 |
| 1944 | 0 |
| 1945 | 0 |
| 1946 | 0 |
| 1947 | 0 |
| 1948 | 0 |
| 1949 | 0 |
| 1950 | 0 |
| 1951 | 0 |
| 1952 | 0 |
| 1953 | 0 |
| 1954 | 0 |
| 1955 | 0 |
| 1956 | 0 |
| 1957 | 0 |
| 1958 | 0 |
| 1959 | 0 |
| 1960 | 0 |
| 1961 | 0 |
| 1962 | 0 |
| 1963 | 0 |
| 1964 | 0 |
| 1965 | 0 |
| 1966 | 0 |
| 1967 | 0 |
| 1968 | 0 |
| 1969 | 0 |
| 1970 | 0 |
| 1971 | 0 |
| 1972 | 0 |
| 1973 | 0 |
| 1974 | 0 |